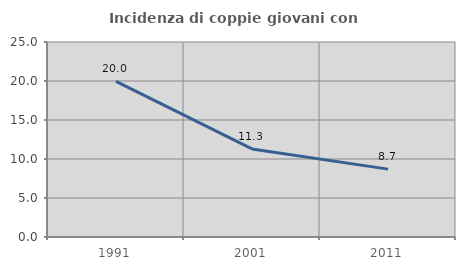
| Category | Incidenza di coppie giovani con figli |
|---|---|
| 1991.0 | 19.96 |
| 2001.0 | 11.294 |
| 2011.0 | 8.703 |